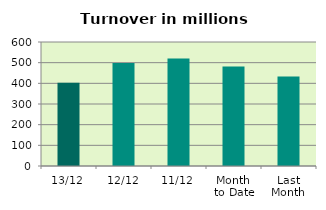
| Category | Series 0 |
|---|---|
| 13/12 | 402.29 |
| 12/12 | 498.55 |
| 11/12 | 519.666 |
| Month 
to Date | 481.317 |
| Last
Month | 433.001 |